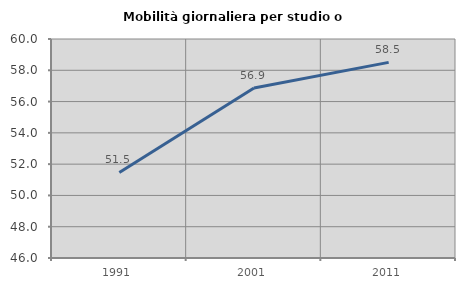
| Category | Mobilità giornaliera per studio o lavoro |
|---|---|
| 1991.0 | 51.466 |
| 2001.0 | 56.873 |
| 2011.0 | 58.505 |